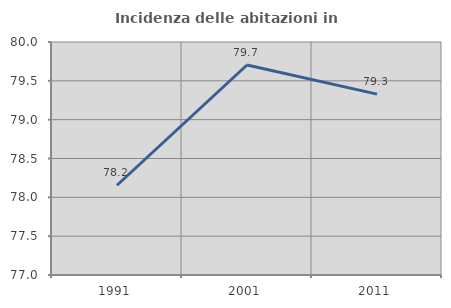
| Category | Incidenza delle abitazioni in proprietà  |
|---|---|
| 1991.0 | 78.156 |
| 2001.0 | 79.704 |
| 2011.0 | 79.328 |